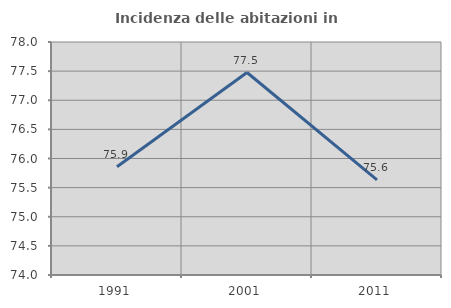
| Category | Incidenza delle abitazioni in proprietà  |
|---|---|
| 1991.0 | 75.858 |
| 2001.0 | 77.476 |
| 2011.0 | 75.633 |